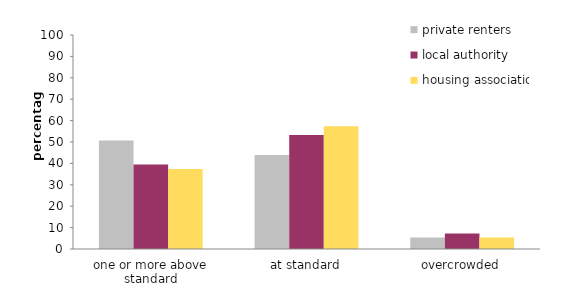
| Category | private renters | local authority | housing association |
|---|---|---|---|
| one or more above standard | 50.746 | 39.507 | 37.327 |
| at standard | 43.879 | 53.25 | 57.323 |
| overcrowded | 5.375 | 7.243 | 5.35 |